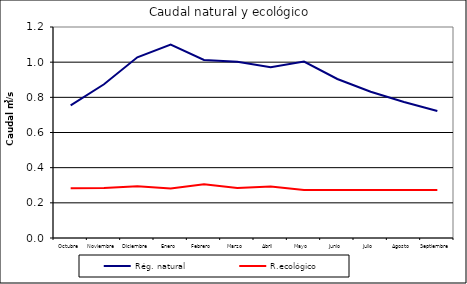
| Category | Rég. natural | R.ecológico |
|---|---|---|
| Octubre | 0.754 | 0.283 |
| Noviembre | 0.874 | 0.284 |
| Diciembre | 1.028 | 0.294 |
| Enero | 1.1 | 0.282 |
| Febrero | 1.012 | 0.306 |
| Marzo | 1.002 | 0.284 |
| Abril | 0.971 | 0.293 |
| Mayo | 1.003 | 0.273 |
| Junio | 0.904 | 0.273 |
| Julio | 0.832 | 0.273 |
| Agosto | 0.773 | 0.273 |
| Septiembre | 0.722 | 0.273 |